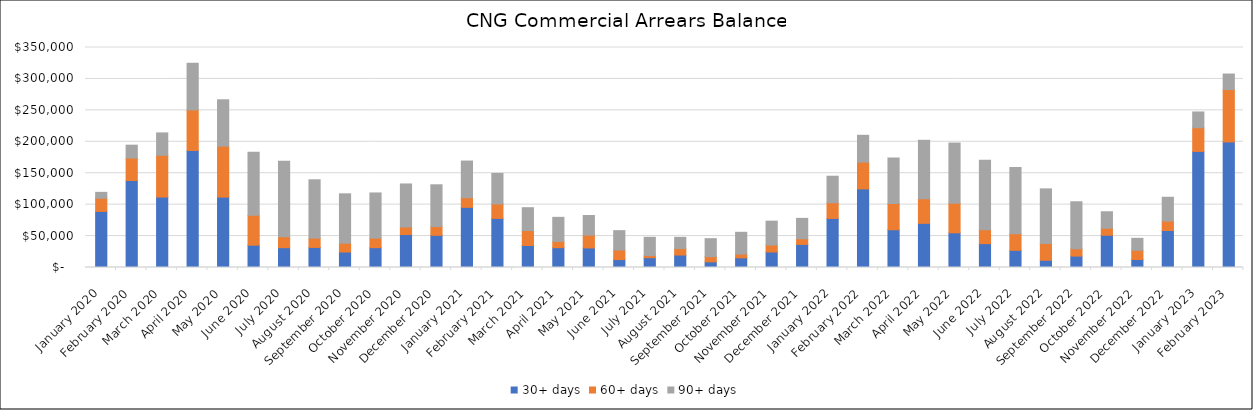
| Category | 30+ days | 60+ days | 90+ days |
|---|---|---|---|
| 2020-01-01 | 89219.35 | 21008.38 | 9333.38 |
| 2020-02-01 | 138443.28 | 35728.2 | 20436.46 |
| 2020-03-01 | 112084.22 | 66370.74 | 35661.59 |
| 2020-04-01 | 186182.85 | 64539.84 | 74182.83 |
| 2020-05-01 | 112041.47 | 81083.67 | 73700.7 |
| 2020-06-01 | 35488.69 | 47504.14 | 100395.63 |
| 2020-07-01 | 31534.37 | 17351.21 | 120030.28 |
| 2020-08-01 | 31906.14 | 14804.89 | 92845.08 |
| 2020-09-01 | 24619.35 | 14032.81 | 78556.19 |
| 2020-10-01 | 31531.25 | 15190.57 | 71862.95 |
| 2020-11-01 | 52428.86 | 11992.16 | 68479.79 |
| 2020-12-01 | 51201.12 | 13901.47 | 66478.09 |
| 2021-01-01 | 95695 | 15311 | 58371 |
| 2021-02-01 | 78125 | 23041 | 48510.58 |
| 2021-03-01 | 34977.88 | 23805.9 | 36350.99 |
| 2021-04-01 | 31541.6 | 9921.86 | 38328.42 |
| 2021-05-01 | 31139.53 | 20331.38 | 31279.94 |
| 2021-06-01 | 12640.08 | 15209.3 | 30769.07 |
| 2021-07-01 | 15618.21 | 3355.28 | 29060.69 |
| 2021-08-01 | 19810.09 | 10266.96 | 17890.63 |
| 2021-09-01 | 8965.98 | 8261.4 | 28662.71 |
| 2021-10-01 | 15418.83 | 5927.21 | 34655.34 |
| 2021-11-01 | 24670.67 | 11138 | 37922.79 |
| 2021-12-01 | 36683.35 | 9057.15 | 32414.32 |
| 2022-01-01 | 78046.17 | 24982.96 | 42193.47 |
| 2022-02-01 | 125042 | 42629.09 | 42629.09 |
| 2022-03-01 | 60071.5 | 41724.96 | 72398.93 |
| 2022-04-01 | 70251.07 | 39120.18 | 92989.57 |
| 2022-05-01 | 55170.35 | 47018.91 | 95826.63 |
| 2022-06-01 | 37967.2 | 22121.75 | 110569.15 |
| 2022-07-01 | 27257.83 | 26593.24 | 105172.44 |
| 2022-08-01 | 11520.91 | 26567.75 | 86990.22 |
| 2022-09-01 | 18097 | 11662.7 | 74818.32 |
| 2022-10-01 | 51332.33 | 11108.93 | 26238.24 |
| 2022-11-01 | 12729.94 | 14681.6 | 18947.36 |
| 2022-12-01 | 58911.52 | 14950.01 | 37875.77 |
| 2023-01-01 | 184628.19 | 37709.82 | 25120.23 |
| 2023-02-01 | 199789.54 | 83236.62 | 24771.95 |